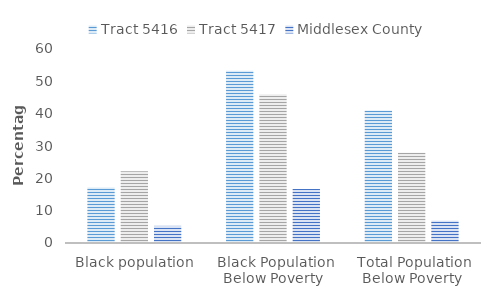
| Category | Tract 5416 | Tract 5417 | Middlesex County |
|---|---|---|---|
|  Black population | 17.16 | 22.16 | 5.3 |
|  Black Population Below Poverty | 53.3 | 46 | 16.7 |
|  Total Population Below Poverty | 40.96 | 27.9 | 6.91 |